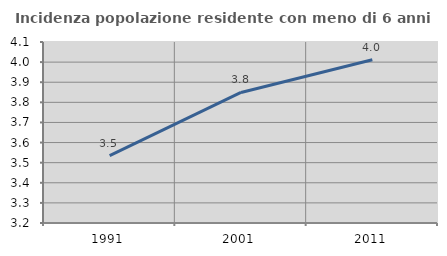
| Category | Incidenza popolazione residente con meno di 6 anni |
|---|---|
| 1991.0 | 3.535 |
| 2001.0 | 3.849 |
| 2011.0 | 4.012 |